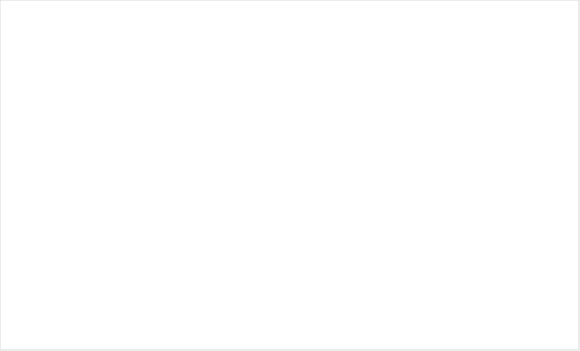
| Category | Итог |
|---|---|
| Не знаю | 4 |
| Так | 12 |